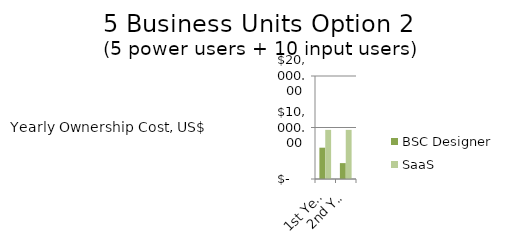
| Category | BSC Designer  | SaaS |
|---|---|---|
| 1st Year | 6080 | 9540 |
| 2nd Year | 3084 | 9540 |